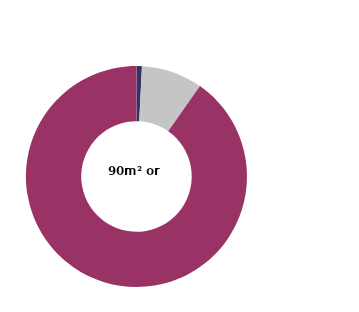
| Category | 90m² or over |
|---|---|
| 1 or 2 | 0.019 |
| 3 | 0.77 |
| 4 | 8.944 |
| 5 or more | 90.267 |